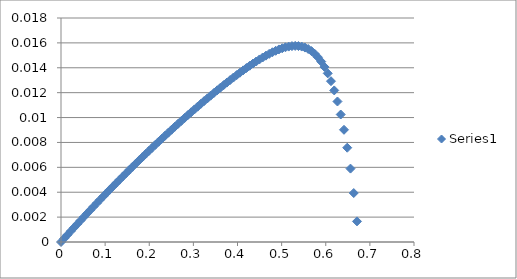
| Category | Series 0 |
|---|---|
| 0.0 | 0 |
| 0.00737 | 0 |
| 0.01474 | 0.001 |
| 0.02212 | 0.001 |
| 0.02949 | 0.001 |
| 0.03686 | 0.001 |
| 0.04423 | 0.002 |
| 0.0516 | 0.002 |
| 0.05897 | 0.002 |
| 0.06635 | 0.003 |
| 0.07372 | 0.003 |
| 0.08109 | 0.003 |
| 0.08846 | 0.003 |
| 0.09583 | 0.004 |
| 0.1032 | 0.004 |
| 0.11058 | 0.004 |
| 0.11795 | 0.004 |
| 0.12532 | 0.005 |
| 0.13269 | 0.005 |
| 0.14006 | 0.005 |
| 0.14743 | 0.006 |
| 0.15481 | 0.006 |
| 0.16218 | 0.006 |
| 0.16955 | 0.006 |
| 0.17692 | 0.007 |
| 0.18429 | 0.007 |
| 0.19166 | 0.007 |
| 0.19904 | 0.007 |
| 0.20641 | 0.008 |
| 0.21378 | 0.008 |
| 0.22115 | 0.008 |
| 0.22852 | 0.008 |
| 0.23589 | 0.009 |
| 0.24327 | 0.009 |
| 0.25064 | 0.009 |
| 0.25801 | 0.009 |
| 0.26538 | 0.009 |
| 0.27275 | 0.01 |
| 0.28012 | 0.01 |
| 0.2875 | 0.01 |
| 0.29487 | 0.01 |
| 0.30224 | 0.011 |
| 0.30961 | 0.011 |
| 0.31698 | 0.011 |
| 0.32435 | 0.011 |
| 0.33173 | 0.012 |
| 0.3391 | 0.012 |
| 0.34647 | 0.012 |
| 0.35384 | 0.012 |
| 0.36121 | 0.012 |
| 0.36858 | 0.013 |
| 0.37596 | 0.013 |
| 0.38333 | 0.013 |
| 0.3907 | 0.013 |
| 0.39807 | 0.013 |
| 0.40544 | 0.014 |
| 0.41282 | 0.014 |
| 0.42019 | 0.014 |
| 0.42756 | 0.014 |
| 0.43493 | 0.014 |
| 0.4423 | 0.015 |
| 0.44967 | 0.015 |
| 0.45705 | 0.015 |
| 0.46442 | 0.015 |
| 0.47179 | 0.015 |
| 0.47916 | 0.015 |
| 0.48653 | 0.015 |
| 0.4939 | 0.015 |
| 0.50128 | 0.016 |
| 0.50865 | 0.016 |
| 0.51602 | 0.016 |
| 0.52339 | 0.016 |
| 0.53076 | 0.016 |
| 0.53813 | 0.016 |
| 0.54551 | 0.016 |
| 0.55288 | 0.016 |
| 0.56025 | 0.016 |
| 0.56762 | 0.015 |
| 0.57499 | 0.015 |
| 0.58236 | 0.015 |
| 0.58974 | 0.014 |
| 0.59711 | 0.014 |
| 0.60448 | 0.014 |
| 0.61185 | 0.013 |
| 0.61922 | 0.012 |
| 0.62659 | 0.011 |
| 0.63397 | 0.01 |
| 0.64134 | 0.009 |
| 0.64871 | 0.008 |
| 0.65608 | 0.006 |
| 0.66345 | 0.004 |
| 0.67082 | 0.002 |
| 0.6782 | -0.001 |
| 0.68557 | -0.004 |
| 0.69294 | -0.008 |
| 0.70031 | -0.012 |
| 0.70768 | -0.016 |
| 0.71505 | -0.022 |
| 0.72243 | -0.028 |
| 0.7298 | -0.036 |